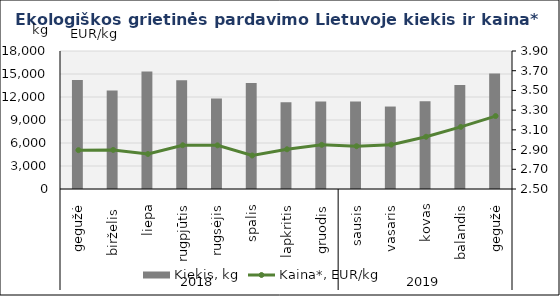
| Category | Kiekis, kg |
|---|---|
| 0 | 14203 |
| 1 | 12864 |
| 2 | 15311 |
| 3 | 14180 |
| 4 | 11803 |
| 5 | 13831 |
| 6 | 11327 |
| 7 | 11397 |
| 8 | 11423 |
| 9 | 10756 |
| 10 | 11447 |
| 11 | 13566 |
| 12 | 15080 |